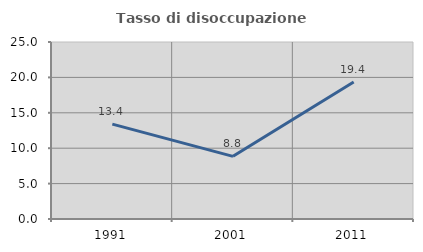
| Category | Tasso di disoccupazione giovanile  |
|---|---|
| 1991.0 | 13.402 |
| 2001.0 | 8.85 |
| 2011.0 | 19.355 |